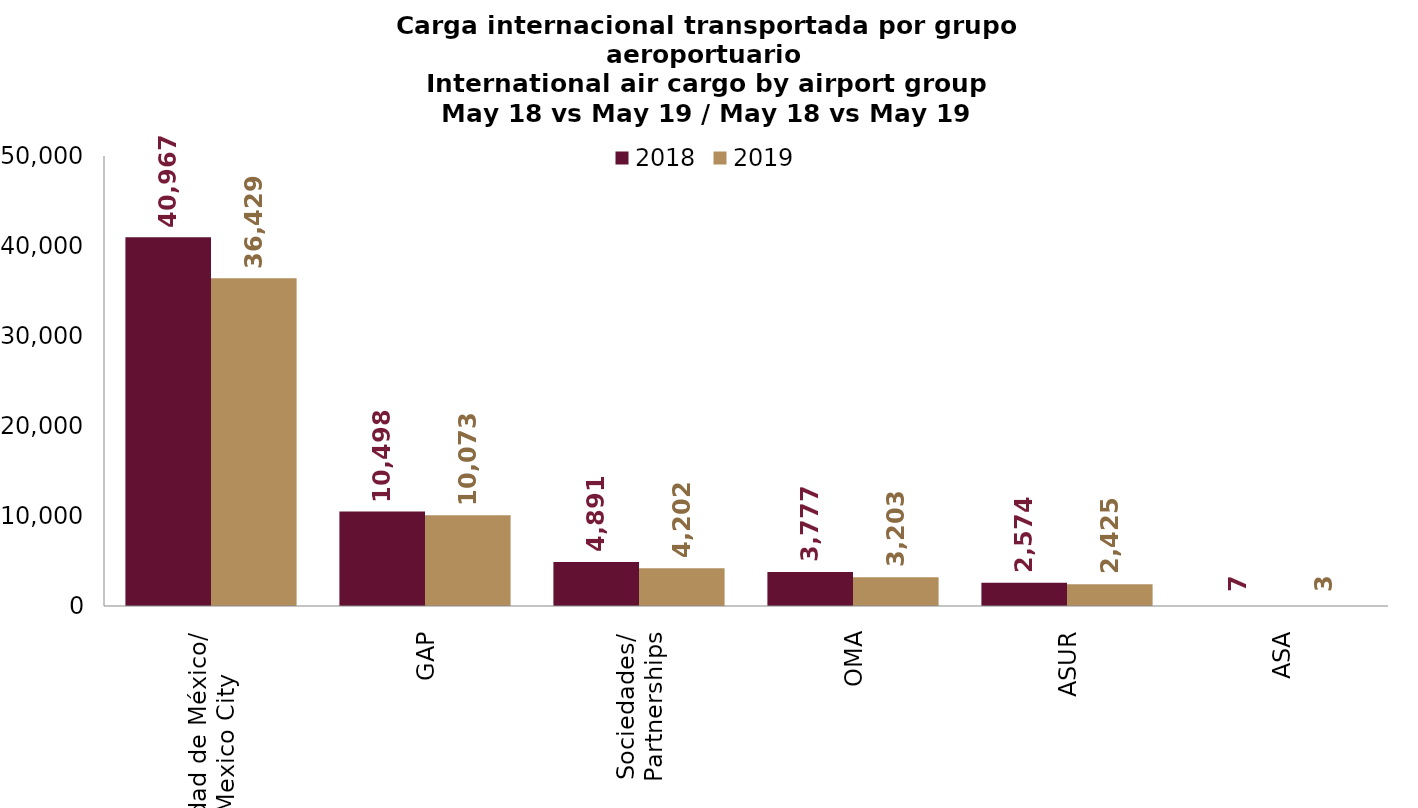
| Category | 2018 | 2019 |
|---|---|---|
| Ciudad de México/
Mexico City | 40967.07 | 36429.03 |
| GAP | 10497.621 | 10073.487 |
| Sociedades/
Partnerships | 4891.343 | 4201.641 |
| OMA | 3777.034 | 3203.183 |
| ASUR | 2574.1 | 2424.624 |
| ASA | 6.764 | 3.4 |